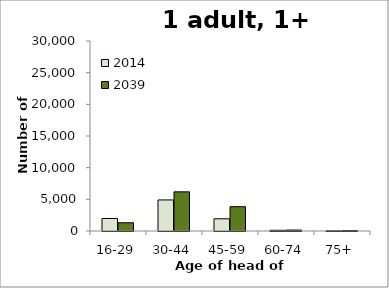
| Category | 2014 | 2039 |
|---|---|---|
| 16-29 | 1975 | 1301 |
| 30-44 | 4903 | 6184 |
| 45-59 | 1931 | 3837 |
| 60-74 | 112 | 149 |
| 75+ | 23 | 62 |